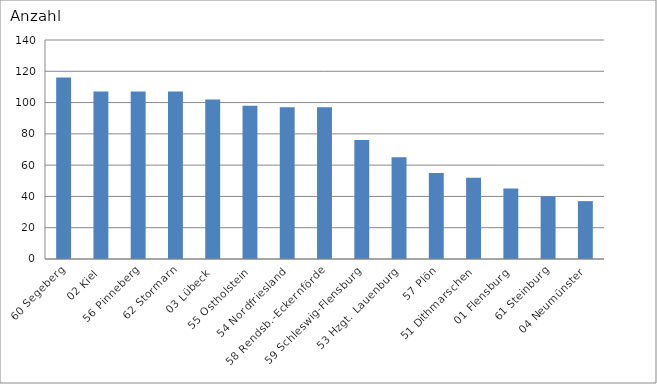
| Category | 60 Segeberg 02 Kiel 56 Pinneberg 62 Stormarn 03 Lübeck 55 Ostholstein 54 Nordfriesland 58 Rendsb.-Eckernförde 59 Schleswig-Flensburg 53 Hzgt. Lauenburg 57 Plön 51 Dithmarschen 01 Flensburg 61 Steinburg 04 Neumünster |
|---|---|
| 60 Segeberg | 116 |
| 02 Kiel | 107 |
| 56 Pinneberg | 107 |
| 62 Stormarn | 107 |
| 03 Lübeck | 102 |
| 55 Ostholstein | 98 |
| 54 Nordfriesland | 97 |
| 58 Rendsb.-Eckernförde | 97 |
| 59 Schleswig-Flensburg | 76 |
| 53 Hzgt. Lauenburg | 65 |
| 57 Plön | 55 |
| 51 Dithmarschen | 52 |
| 01 Flensburg | 45 |
| 61 Steinburg | 40 |
| 04 Neumünster | 37 |